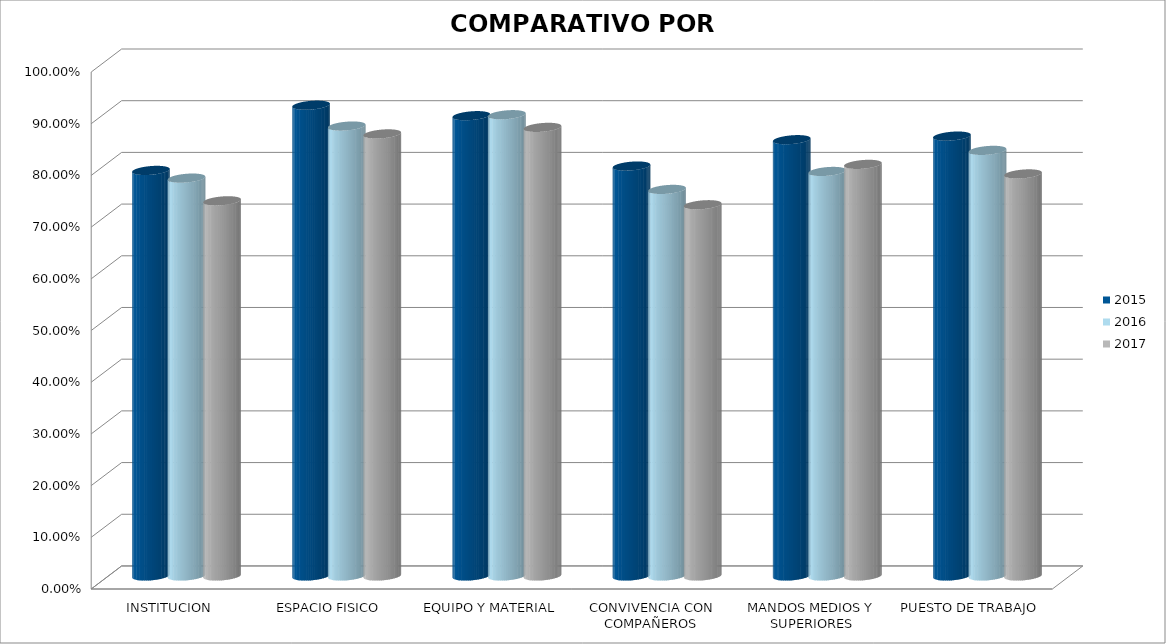
| Category | 2015 | 2016 | 2017 |
|---|---|---|---|
| INSTITUCION | 0.785 | 0.77 | 0.726 |
| ESPACIO FISICO | 0.911 | 0.87 | 0.855 |
| EQUIPO Y MATERIAL | 0.89 | 0.892 | 0.868 |
| CONVIVENCIA CON COMPAÑEROS | 0.793 | 0.748 | 0.718 |
| MANDOS MEDIOS Y SUPERIORES | 0.844 | 0.783 | 0.796 |
| PUESTO DE TRABAJO | 0.851 | 0.823 | 0.778 |